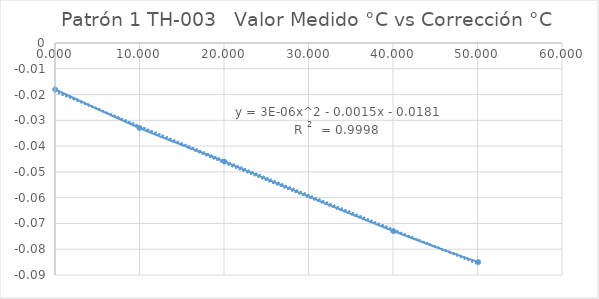
| Category | Patrón 1 TH-003 |
|---|---|
| 0.018 | -0.018 |
| 9.998 | -0.033 |
| 20.045 | -0.046 |
| 40.049 | -0.073 |
| 50.074 | -0.085 |